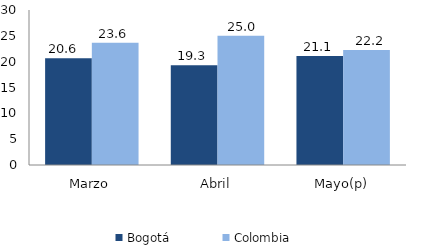
| Category | Bogotá | Colombia |
|---|---|---|
| Marzo | 20.647 | 23.642 |
| Abril | 19.306 | 25.04 |
| Mayo(p) | 21.104 | 22.241 |